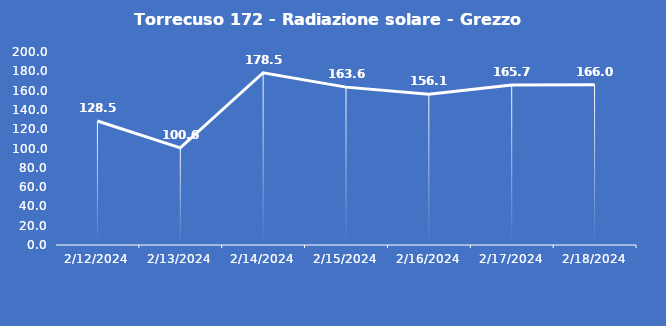
| Category | Torrecuso 172 - Radiazione solare - Grezzo (W/m2) |
|---|---|
| 2/12/24 | 128.5 |
| 2/13/24 | 100.6 |
| 2/14/24 | 178.5 |
| 2/15/24 | 163.6 |
| 2/16/24 | 156.1 |
| 2/17/24 | 165.7 |
| 2/18/24 | 166 |